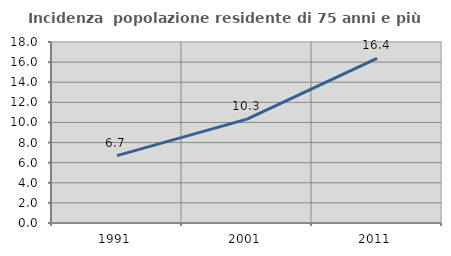
| Category | Incidenza  popolazione residente di 75 anni e più |
|---|---|
| 1991.0 | 6.699 |
| 2001.0 | 10.326 |
| 2011.0 | 16.364 |